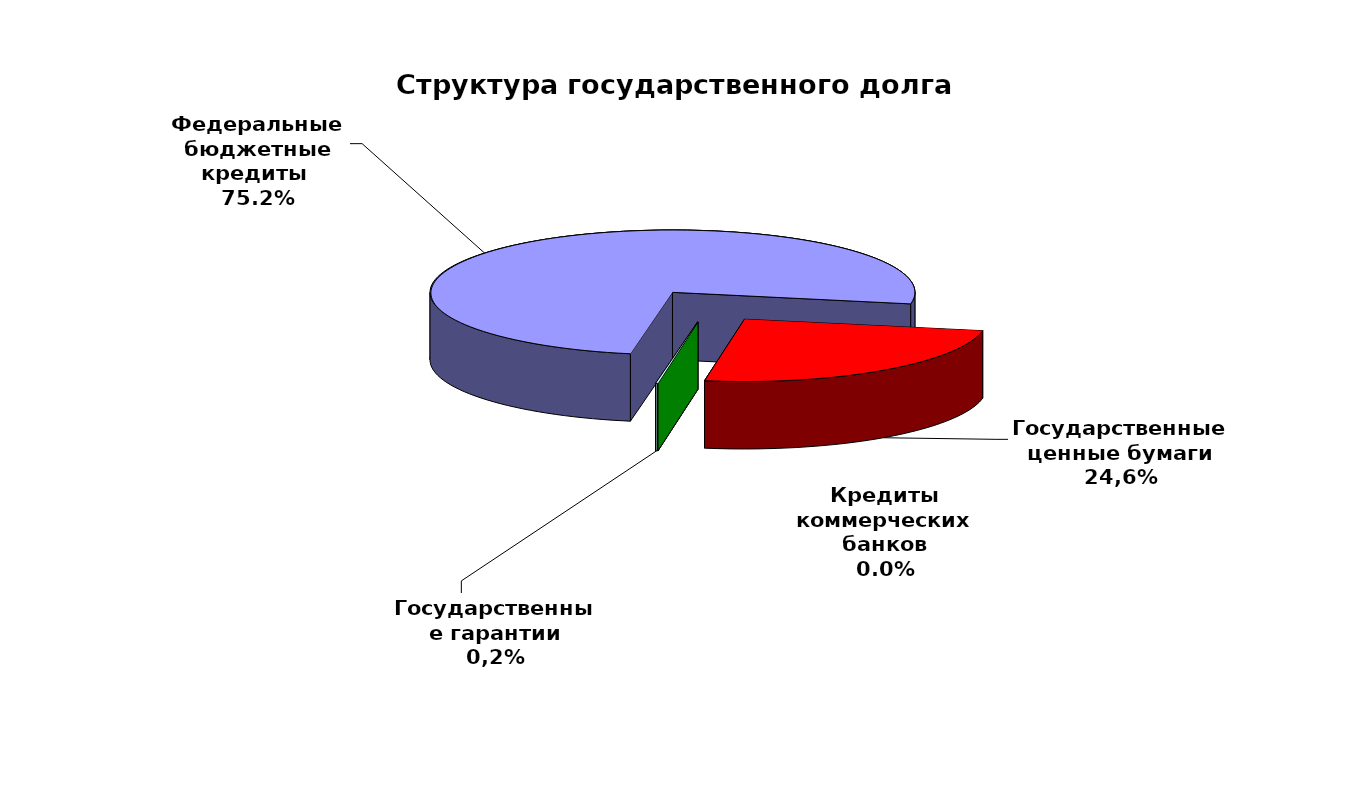
| Category | Series 0 |
|---|---|
| Федеральные бюджетные кредиты  | 103607689.942 |
| Государственные ценные бумаги | 34000000 |
| Кредиты коммерческих банков | 0 |
| Государственные гарантии | 199238.75 |